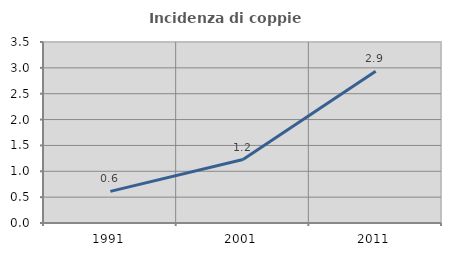
| Category | Incidenza di coppie miste |
|---|---|
| 1991.0 | 0.612 |
| 2001.0 | 1.227 |
| 2011.0 | 2.933 |